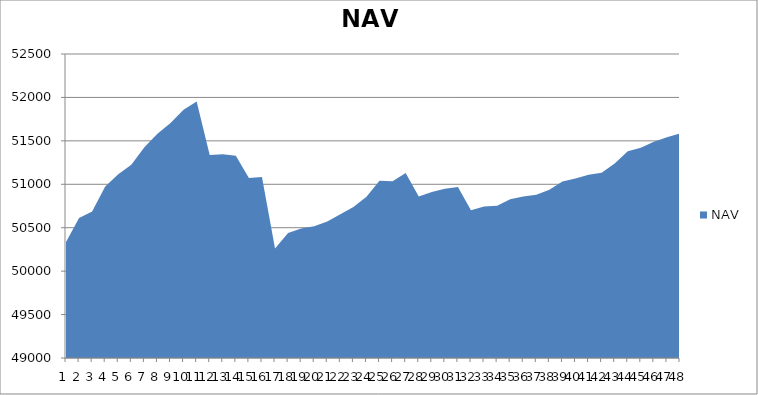
| Category | NAV |
|---|---|
| 0 | 50336.57 |
| 1 | 50612.255 |
| 2 | 50687.913 |
| 3 | 50975.413 |
| 4 | 51115.874 |
| 5 | 51223.542 |
| 6 | 51427.364 |
| 7 | 51580.567 |
| 8 | 51704.692 |
| 9 | 51858.016 |
| 10 | 51951.766 |
| 11 | 51336.067 |
| 12 | 51345.356 |
| 13 | 51328.667 |
| 14 | 51072.985 |
| 15 | 51085.199 |
| 16 | 50261.67 |
| 17 | 50438.394 |
| 18 | 50489.896 |
| 19 | 50518.251 |
| 20 | 50572.468 |
| 21 | 50655.55 |
| 22 | 50737.787 |
| 23 | 50856.035 |
| 24 | 51041.806 |
| 25 | 51034.925 |
| 26 | 51128.589 |
| 27 | 50859.456 |
| 28 | 50911.137 |
| 29 | 50950.007 |
| 30 | 50970.175 |
| 31 | 50701.326 |
| 32 | 50743.495 |
| 33 | 50751.546 |
| 34 | 50826.725 |
| 35 | 50860.533 |
| 36 | 50879.283 |
| 37 | 50936.644 |
| 38 | 51031.381 |
| 39 | 51065.306 |
| 40 | 51109.987 |
| 41 | 51132.251 |
| 42 | 51238.242 |
| 43 | 51380.786 |
| 44 | 51420.042 |
| 45 | 51490.787 |
| 46 | 51541.14 |
| 47 | 51584.924 |